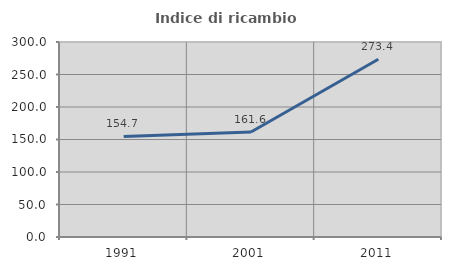
| Category | Indice di ricambio occupazionale  |
|---|---|
| 1991.0 | 154.69 |
| 2001.0 | 161.628 |
| 2011.0 | 273.435 |